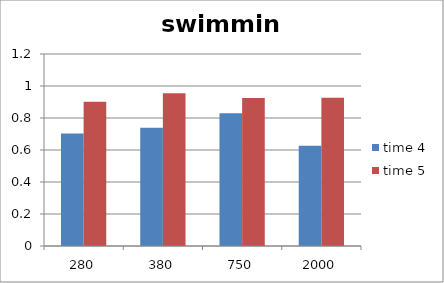
| Category | time 4 | time 5 |
|---|---|---|
| 280.0 | 0.703 | 0.902 |
| 380.0 | 0.739 | 0.955 |
| 750.0 | 0.83 | 0.925 |
| 2000.0 | 0.626 | 0.926 |